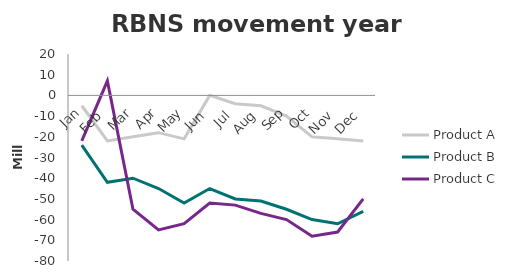
| Category | Product A | Product B | Product C |
|---|---|---|---|
| Jan | -5 | -24 | -22 |
| Feb | -22 | -42 | 7 |
| Mar | -20 | -40 | -55 |
| Apr | -18 | -45 | -65 |
| May | -21 | -52 | -62 |
| Jun | 0 | -45 | -52 |
| Jul | -4 | -50 | -53 |
| Aug | -5 | -51 | -57 |
| Sep | -10 | -55 | -60 |
| Oct | -20 | -60 | -68 |
| Nov | -21 | -62 | -66 |
| Dec | -22 | -56 | -50 |